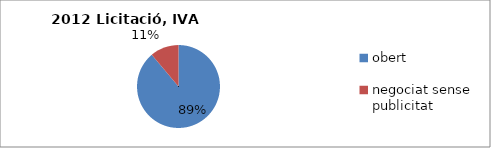
| Category | Licitació, IVA exclòs |
|---|---|
| obert | 15866514.65 |
| negociat sense publicitat  | 1989747.87 |